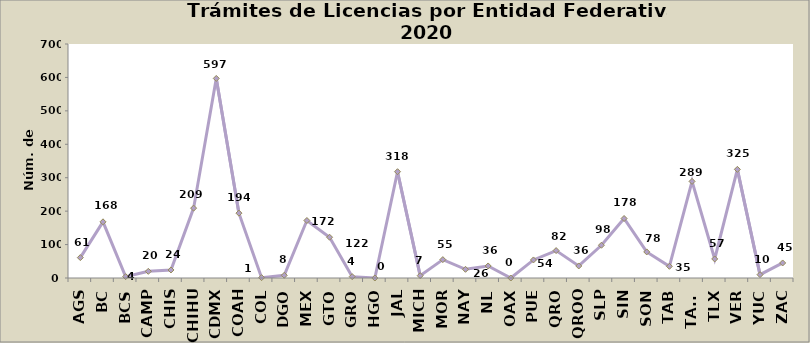
| Category | Series 0 |
|---|---|
| AGS | 61 |
| BC | 168 |
| BCS | 4 |
| CAMP | 20 |
| CHIS | 24 |
| CHIHU | 209 |
| CDMX | 597 |
| COAH | 194 |
| COL | 1 |
| DGO | 8 |
| MEX | 172 |
| GTO | 122 |
| GRO | 4 |
| HGO | 0 |
| JAL | 318 |
| MICH | 7 |
| MOR | 55 |
| NAY | 26 |
| NL | 36 |
| OAX | 0 |
| PUE | 54 |
| QRO | 82 |
| QROO | 36 |
| SLP | 98 |
| SIN | 178 |
| SON | 78 |
| TAB | 35 |
| TAMS | 289 |
| TLX | 57 |
| VER | 325 |
| YUC | 10 |
| ZAC | 45 |